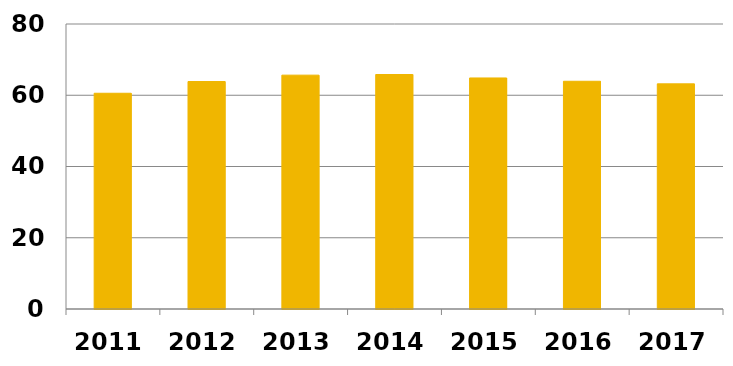
| Category | Aritmetiskt medel |
|---|---|
| 2011.0 | 60.558 |
| 2012.0 | 63.852 |
| 2013.0 | 65.642 |
| 2014.0 | 65.821 |
| 2015.0 | 64.851 |
| 2016.0 | 63.923 |
| 2017.0 | 63.2 |